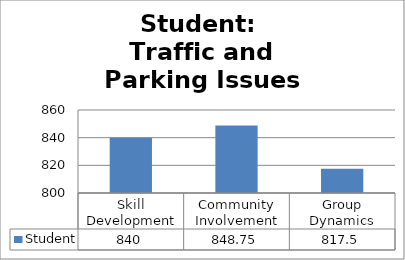
| Category | Student |
|---|---|
| Skill Development | 840 |
| Community Involvement | 848.75 |
| Group Dynamics | 817.5 |